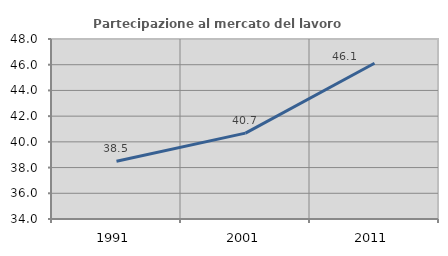
| Category | Partecipazione al mercato del lavoro  femminile |
|---|---|
| 1991.0 | 38.491 |
| 2001.0 | 40.679 |
| 2011.0 | 46.115 |